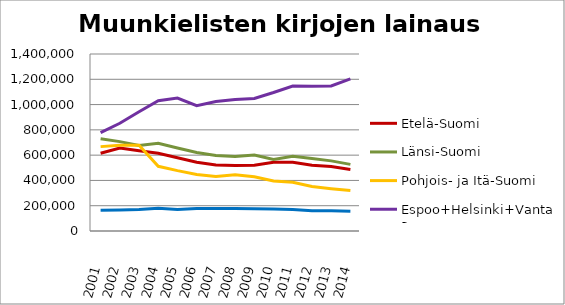
| Category | Etelä-Suomi | Länsi-Suomi | Pohjois- ja Itä-Suomi | Espoo+Helsinki+Vantaa | Muu Uusimaa |
|---|---|---|---|---|---|
| 2001.0 | 615230 | 729231 | 667393 | 777454 | 164209 |
| 2002.0 | 657041 | 706916 | 677759 | 852473 | 166482 |
| 2003.0 | 634354 | 676669 | 677840 | 943594 | 169895 |
| 2004.0 | 614916 | 694661 | 511975 | 1030256 | 179374 |
| 2005.0 | 580032 | 656678 | 477463 | 1051401 | 169104 |
| 2006.0 | 543337 | 621388 | 447061 | 990797 | 176984 |
| 2007.0 | 521721 | 597140 | 431728 | 1024428 | 176980 |
| 2008.0 | 517261 | 588785 | 444093 | 1040965 | 177016 |
| 2009.0 | 520035 | 601448 | 428527 | 1048535 | 175656 |
| 2010.0 | 544310 | 565588 | 395636 | 1095817 | 173550 |
| 2011.0 | 543093 | 591400 | 386041 | 1147217 | 169877 |
| 2012.0 | 520039 | 573756 | 351405 | 1145797 | 160345 |
| 2013.0 | 509288 | 554780 | 334218 | 1146942 | 159555 |
| 2014.0 | 486512 | 526846 | 320216 | 1203239 | 155846 |